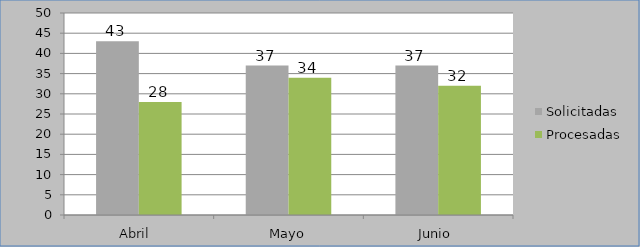
| Category | Solicitadas | Procesadas |
|---|---|---|
| Abril  | 43 | 28 |
| Mayo | 37 | 34 |
| Junio  | 37 | 32 |